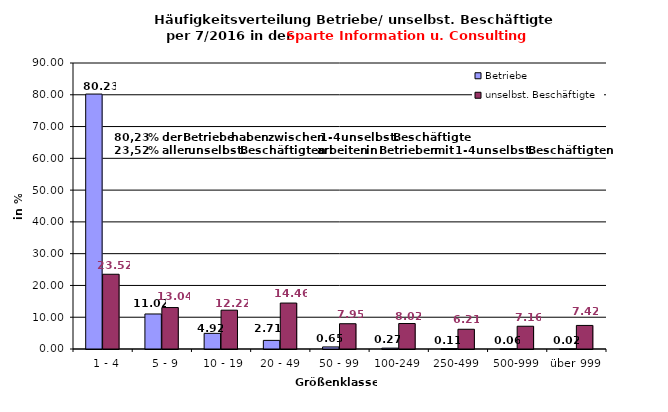
| Category | Betriebe | unselbst. Beschäftigte |
|---|---|---|
|   1 - 4 | 80.227 | 23.519 |
|   5 - 9 | 11.022 | 13.043 |
|  10 - 19 | 4.922 | 12.217 |
| 20 - 49 | 2.714 | 14.458 |
| 50 - 99 | 0.652 | 7.954 |
| 100-249 | 0.273 | 8.015 |
| 250-499 | 0.105 | 6.212 |
| 500-999 | 0.063 | 7.162 |
| über 999 | 0.021 | 7.419 |